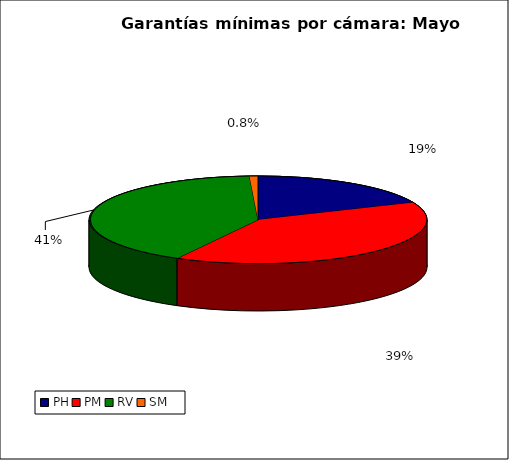
| Category | Series 0 |
|---|---|
| PH | 1923.665 |
| PM | 4100.891 |
| RV | 4289.275 |
| SM | 84.233 |